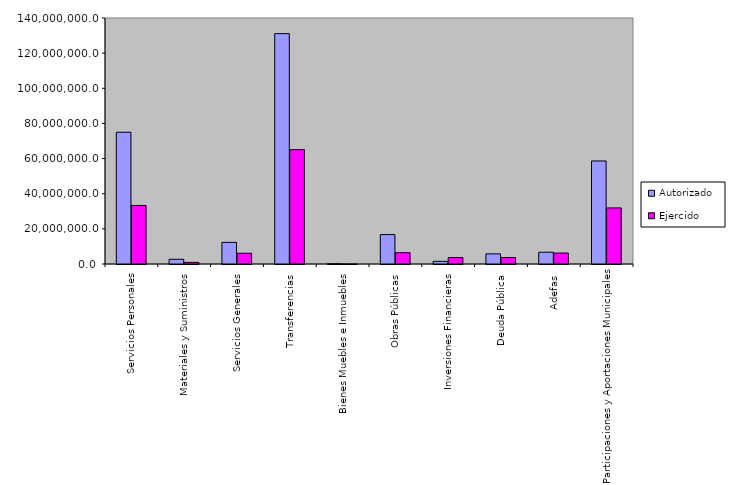
| Category | Autorizado | Ejercido |
|---|---|---|
| 0 | 74987851.6 | 33323908.8 |
| 1 | 2683737.4 | 911438.5 |
| 2 | 12307259.3 | 6121346.9 |
| 3 | 131082558.5 | 65048552.2 |
| 4 | 141744 | 4860.9 |
| 5 | 16732518.4 | 6442824 |
| 6 | 1528644.5 | 3677683.1 |
| 7 | 5776982.7 | 3683302.4 |
| 8 | 6709482.3 | 6220128.5 |
| 9 | 58642613.9 | 31912660 |